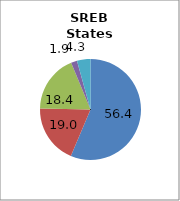
| Category | 50 states and D.C. |
|---|---|
| White | 56.359 |
| Black | 18.977 |
| Hispanic | 18.407 |
| Two or More Races | 1.934 |
| All Other1 | 4.323 |